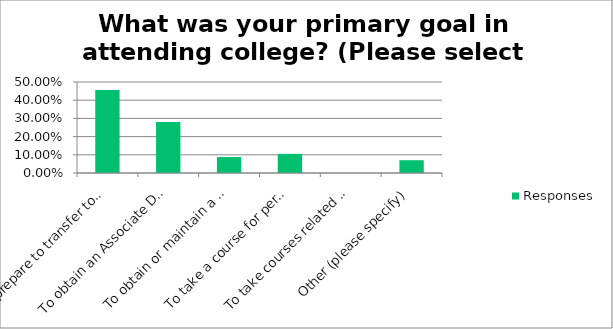
| Category | Responses |
|---|---|
| To prepare to transfer to a four-year college/university | 0.456 |
| To obtain an Associate Degree | 0.281 |
| To obtain or maintain a certificate | 0.088 |
| To take a course for personal enrichment | 0.105 |
| To take courses related to my job | 0 |
| Other (please specify) | 0.07 |